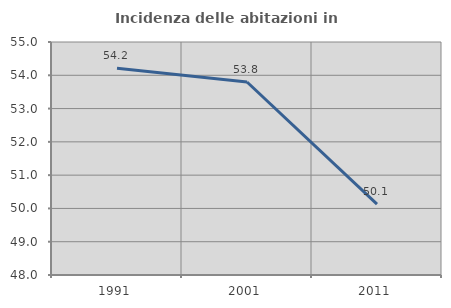
| Category | Incidenza delle abitazioni in proprietà  |
|---|---|
| 1991.0 | 54.214 |
| 2001.0 | 53.798 |
| 2011.0 | 50.129 |